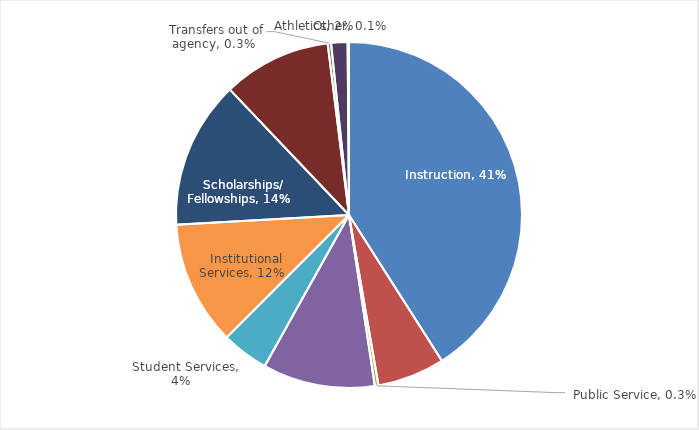
| Category | Series 0 |
|---|---|
|   Instruction | 0.41 |
|   Research | 0.063 |
|   Public Service | 0.003 |
|   Academic Support | 0.105 |
|   Student Services | 0.044 |
|   Institutional Services | 0.116 |
|   Scholarships/ Fellowships | 0.138 |
|   Plant Operations/ Maintenance | 0.101 |
|   Transfers out of agency | 0.003 |
|   Athletics | 0.015 |
|   Other | 0.001 |